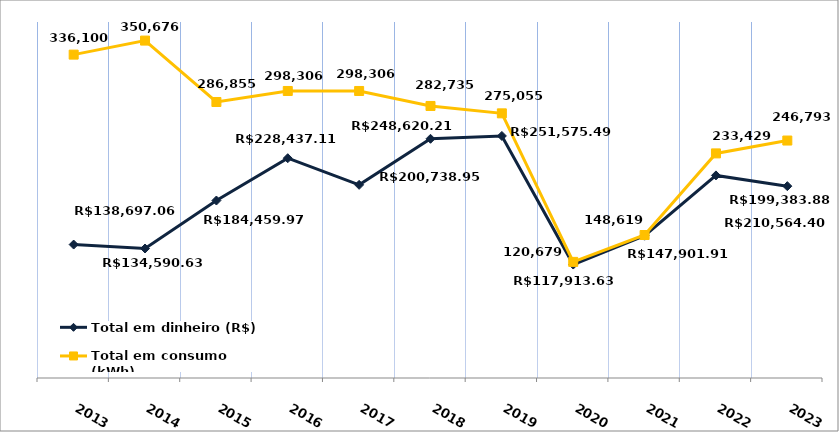
| Category | Total em dinheiro (R$) |
|---|---|
| 2013.0 | 138697.06 |
| 2014.0 | 134590.63 |
| 2015.0 | 184459.97 |
| 2016.0 | 228437.11 |
| 2017.0 | 200738.95 |
| 2018.0 | 248620.21 |
| 2019.0 | 251575.49 |
| 2020.0 | 117913.63 |
| 2021.0 | 147901.91 |
| 2022.0 | 210564.4 |
| 2023.0 | 199383.88 |